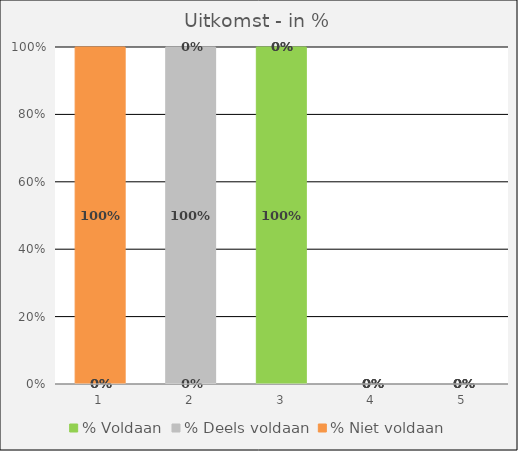
| Category | % Voldaan | % Deels voldaan | % Niet voldaan |
|---|---|---|---|
| 0 | 0 | 0 | 1 |
| 1 | 0 | 1 | 0 |
| 2 | 1 | 0 | 0 |
| 3 | 0 | 0 | 0 |
| 4 | 0 | 0 | 0 |